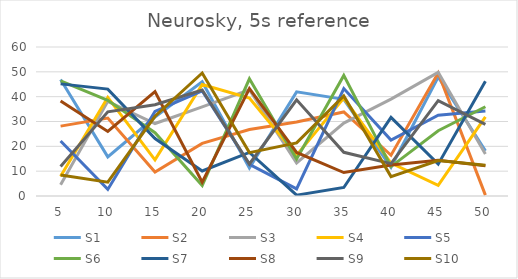
| Category | S1 | S2 | S3 | S4 | S5 | S6 | S7 | S8 | S9 | S10 |
|---|---|---|---|---|---|---|---|---|---|---|
| 5.0 | 46.89 | 28.14 | 4.5 | 7.95 | 22.17 | 46.4 | 45.15 | 38.3 | 11.89 | 8.48 |
| 10.0 | 15.76 | 31.41 | 38.11 | 39.73 | 2.65 | 38.51 | 43.04 | 26 | 33.88 | 5.54 |
| 15.0 | 31.82 | 9.67 | 29.18 | 14.53 | 34.04 | 25.47 | 23.14 | 42.08 | 36.78 | 32.11 |
| 20.0 | 46.01 | 21.19 | 35.92 | 44.89 | 42.29 | 4.21 | 10.07 | 5.58 | 42.69 | 49.53 |
| 25.0 | 11.24 | 26.75 | 42.78 | 39.45 | 12.79 | 47.2 | 17.55 | 43.26 | 12.89 | 17.47 |
| 30.0 | 41.94 | 29.79 | 13.33 | 16.45 | 2.88 | 14.91 | 0.35 | 17.52 | 38.72 | 21.38 |
| 35.0 | 38.91 | 33.84 | 29.38 | 39.42 | 43.26 | 48.56 | 3.43 | 9.44 | 17.6 | 40.32 |
| 40.0 | 11.56 | 16.41 | 39.03 | 13.24 | 22.53 | 11.84 | 31.64 | 12.52 | 13.05 | 7.82 |
| 45.0 | 47.94 | 49.5 | 49.79 | 4.31 | 32.53 | 26.26 | 12.83 | 14.38 | 38.38 | 14.31 |
| 50.0 | 18.17 | 0.34 | 16.9 | 31.85 | 34.22 | 35.93 | 46.2 | 12.19 | 28.81 | 12.38 |